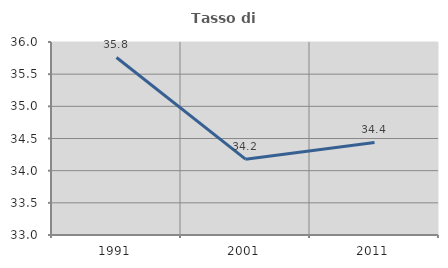
| Category | Tasso di occupazione   |
|---|---|
| 1991.0 | 35.76 |
| 2001.0 | 34.178 |
| 2011.0 | 34.439 |